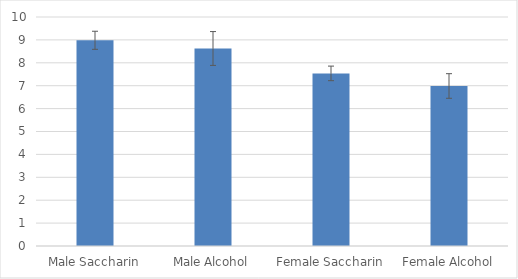
| Category | Series 0 |
|---|---|
| Male Saccharin | 8.983 |
| Male Alcohol | 8.625 |
| Female Saccharin | 7.538 |
| Female Alcohol | 6.988 |